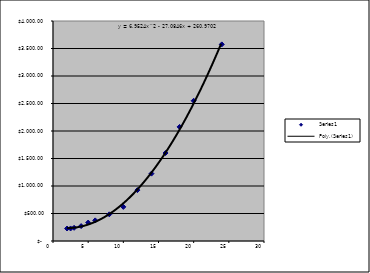
| Category | Series 0 |
|---|---|
| 2.0 | 227 |
| 2.5 | 228 |
| 3.0 | 240 |
| 4.0 | 271 |
| 5.0 | 335 |
| 6.0 | 375 |
| 8.0 | 485 |
| 10.0 | 620 |
| 12.0 | 925 |
| 14.0 | 1225 |
| 16.0 | 1600 |
| 18.0 | 2075 |
| 20.0 | 2550 |
| 24.0 | 3575 |